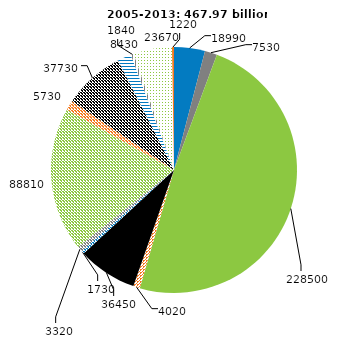
| Category | Series 0 |
|---|---|
| Agriculture | 18990 |
| Chemicals | 7530 |
| Energy | 228500 |
| Entertainment | 4020 |
| Finance | 36450 |
| Healthcare | 1730 |
| Logistics | 3320 |
| Metals | 88810 |
| Other | 5730 |
| Real estate | 37730 |
| Technology | 8430 |
| Tourism | 1840 |
| Transport | 23670 |
| Utilities | 1220 |